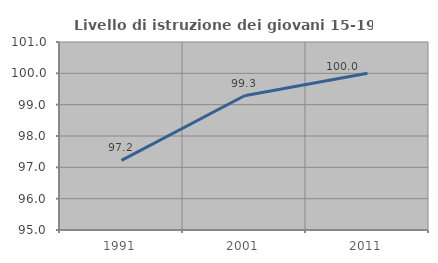
| Category | Livello di istruzione dei giovani 15-19 anni |
|---|---|
| 1991.0 | 97.222 |
| 2001.0 | 99.286 |
| 2011.0 | 100 |